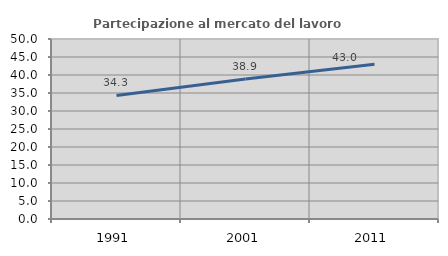
| Category | Partecipazione al mercato del lavoro  femminile |
|---|---|
| 1991.0 | 34.324 |
| 2001.0 | 38.907 |
| 2011.0 | 42.962 |